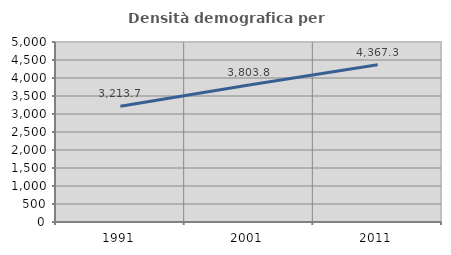
| Category | Densità demografica |
|---|---|
| 1991.0 | 3213.684 |
| 2001.0 | 3803.842 |
| 2011.0 | 4367.262 |